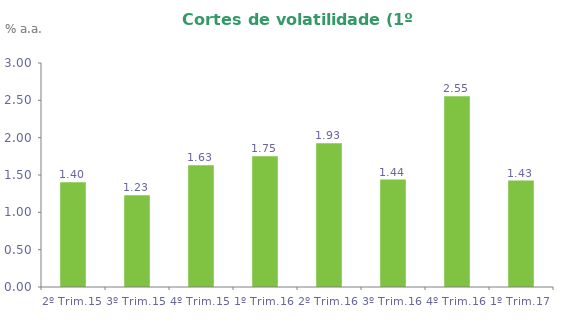
| Category | Series 0 |
|---|---|
| 2º Trim.15 | 1.404 |
| 3º Trim.15 | 1.23 |
| 4º Trim.15 | 1.63 |
| 1º Trim.16 | 1.75 |
| 2º Trim.16 | 1.926 |
| 3º Trim.16 | 1.44 |
| 4º Trim.16 | 2.555 |
| 1º Trim.17 | 1.426 |